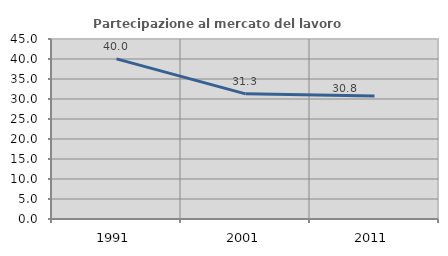
| Category | Partecipazione al mercato del lavoro  femminile |
|---|---|
| 1991.0 | 40.038 |
| 2001.0 | 31.286 |
| 2011.0 | 30.754 |